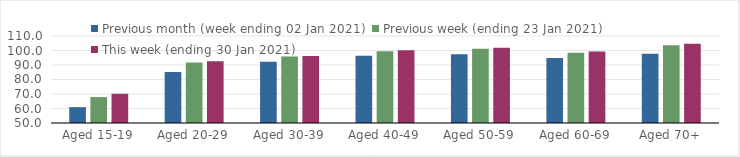
| Category | Previous month (week ending 02 Jan 2021) | Previous week (ending 23 Jan 2021) | This week (ending 30 Jan 2021) |
|---|---|---|---|
| Aged 15-19 | 60.94 | 67.87 | 70.15 |
| Aged 20-29 | 85.15 | 91.65 | 92.51 |
| Aged 30-39 | 92.24 | 95.85 | 96.29 |
| Aged 40-49 | 96.39 | 99.56 | 100.12 |
| Aged 50-59 | 97.47 | 101.13 | 101.9 |
| Aged 60-69 | 94.82 | 98.42 | 99.32 |
| Aged 70+ | 97.76 | 103.62 | 104.63 |